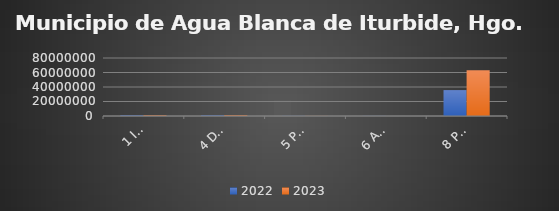
| Category | 2022 | 2023 |
|---|---|---|
| 1 IMPUESTOS | 1023287 | 1002850 |
| 4 DERECHOS | 1008685.31 | 1123187.1 |
| 5 PRODUCTOS | 205468.13 | 134988.59 |
| 6 APROVECHAMIENTOS | 161150 | 2600 |
| 8 PARTICIPACIONES  | 35743868.57 | 63030201.42 |